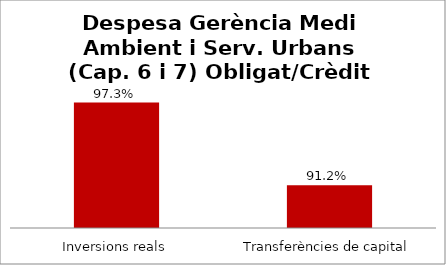
| Category | Series 0 |
|---|---|
| Inversions reals | 0.973 |
| Transferències de capital | 0.912 |